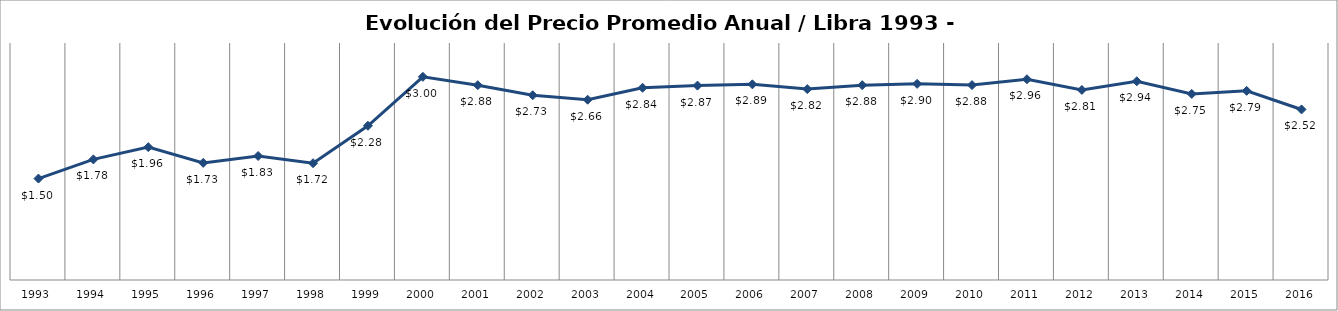
| Category | Series 0 |
|---|---|
| 1993.0 | 1.498 |
| 1994.0 | 1.781 |
| 1995.0 | 1.962 |
| 1996.0 | 1.73 |
| 1997.0 | 1.831 |
| 1998.0 | 1.725 |
| 1999.0 | 2.278 |
| 2000.0 | 3 |
| 2001.0 | 2.877 |
| 2002.0 | 2.728 |
| 2003.0 | 2.662 |
| 2004.0 | 2.839 |
| 2005.0 | 2.871 |
| 2006.0 | 2.889 |
| 2007.0 | 2.819 |
| 2008.0 | 2.877 |
| 2009.0 | 2.896 |
| 2010.0 | 2.879 |
| 2011.0 | 2.965 |
| 2012.0 | 2.807 |
| 2013.0 | 2.935 |
| 2014.0 | 2.748 |
| 2015.0 | 2.793 |
| 2016.0 | 2.519 |